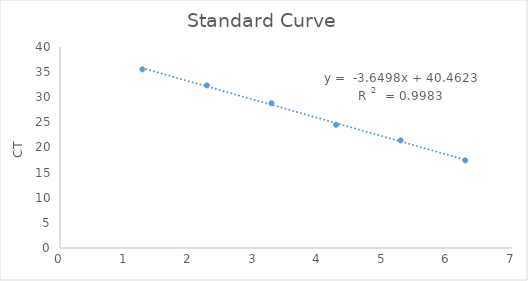
| Category | Series 0 |
|---|---|
| 6.275167333820245 | 17.435 |
| 5.275167333820245 | 21.419 |
| 4.275167333820245 | 24.506 |
| 3.2751673338202454 | 28.825 |
| 2.2751673338202454 | 32.363 |
| 1.2751673338202454 | 35.553 |